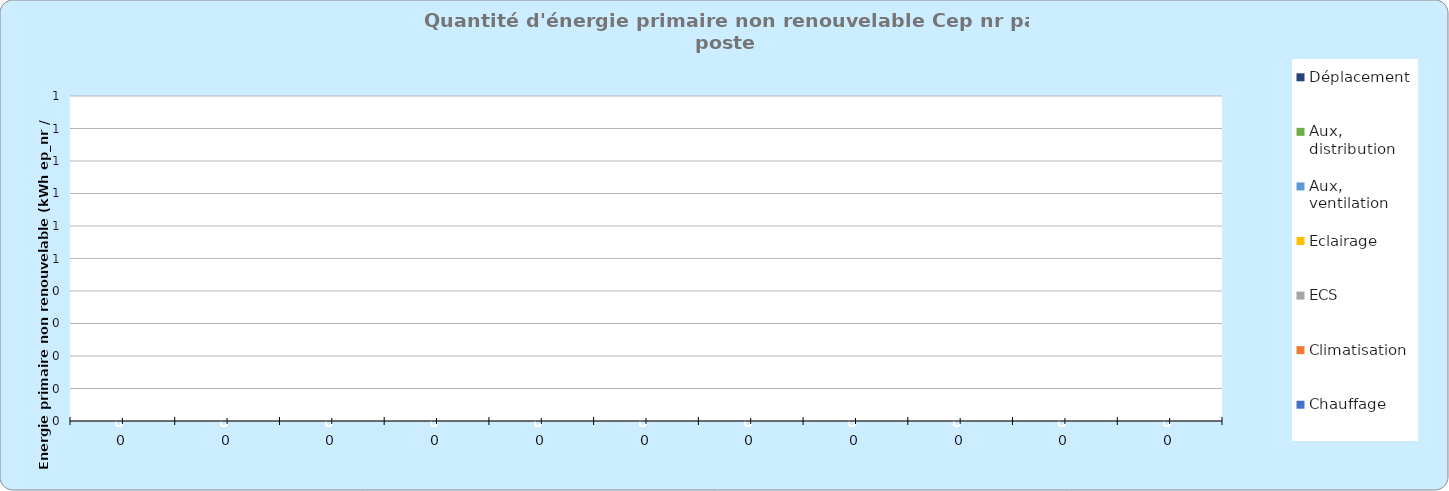
| Category | Chauffage | Climatisation | ECS | Eclairage | Aux, ventilation | Aux, distribution | Déplacement |
|---|---|---|---|---|---|---|---|
| 0.0 | 0 | 0 | 0 | 0 | 0 | 0 | 0 |
| 0.0 | 0 | 0 | 0 | 0 | 0 | 0 | 0 |
| 0.0 | 0 | 0 | 0 | 0 | 0 | 0 | 0 |
| 0.0 | 0 | 0 | 0 | 0 | 0 | 0 | 0 |
| 0.0 | 0 | 0 | 0 | 0 | 0 | 0 | 0 |
| 0.0 | 0 | 0 | 0 | 0 | 0 | 0 | 0 |
| 0.0 | 0 | 0 | 0 | 0 | 0 | 0 | 0 |
| 0.0 | 0 | 0 | 0 | 0 | 0 | 0 | 0 |
| 0.0 | 0 | 0 | 0 | 0 | 0 | 0 | 0 |
| 0.0 | 0 | 0 | 0 | 0 | 0 | 0 | 0 |
| 0.0 | 0 | 0 | 0 | 0 | 0 | 0 | 0 |